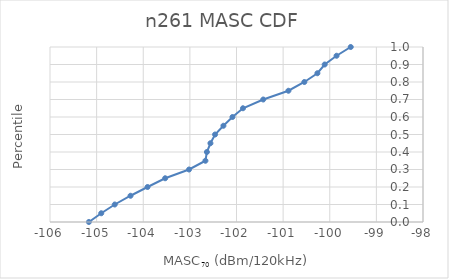
| Category | n261 |
|---|---|
| -105.16616962510335 | 0 |
| -104.90086785004134 | 0.05 |
| -104.6112 | 0.1 |
| -104.2728 | 0.15 |
| -103.908 | 0.2 |
| -103.53 | 0.25 |
| -103.01784 | 0.3 |
| -102.6661 | 0.35 |
| -102.6352 | 0.4 |
| -102.55893999999999 | 0.45 |
| -102.46 | 0.5 |
| -102.2805454765878 | 0.55 |
| -102.08603841110487 | 0.6 |
| -101.86142626148047 | 0.65 |
| -101.4264133269634 | 0.7 |
| -100.8862 | 0.75 |
| -100.54456 | 0.8 |
| -100.26476 | 0.85 |
| -100.10864000000001 | 0.9 |
| -99.85396 | 0.95 |
| -99.55 | 1 |